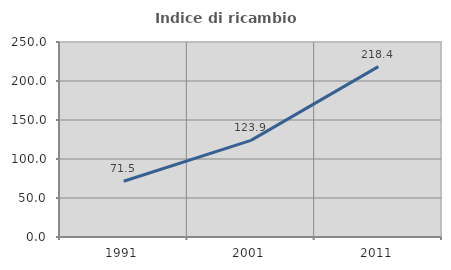
| Category | Indice di ricambio occupazionale  |
|---|---|
| 1991.0 | 71.524 |
| 2001.0 | 123.886 |
| 2011.0 | 218.449 |